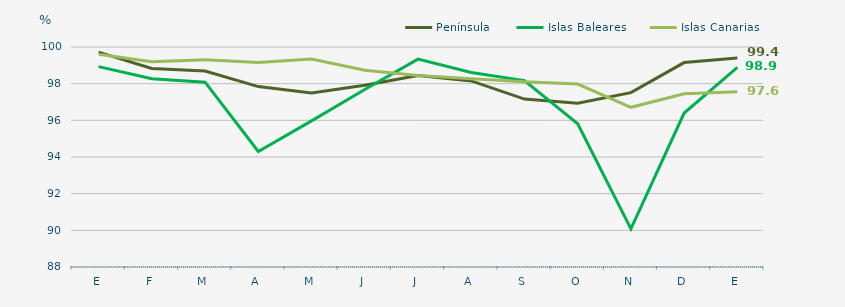
| Category | Península | Islas Baleares | Islas Canarias |
|---|---|---|---|
| E | 99.72 | 98.93 | 99.6 |
| F | 98.83 | 98.27 | 99.19 |
| M | 98.69 | 98.08 | 99.3 |
| A | 97.84 | 94.3 | 99.16 |
| M | 97.49 | 95.97 | 99.35 |
| J | 97.91 | 97.68 | 98.73 |
| J | 98.45 | 99.34 | 98.44 |
| A | 98.15 | 98.61 | 98.27 |
| S | 97.16 | 98.17 | 98.1 |
| O | 96.93 | 95.81 | 97.98 |
| N | 97.51 | 90.08 | 96.71 |
| D | 99.15 | 96.4 | 97.45 |
| E | 99.4 | 98.89 | 97.56 |